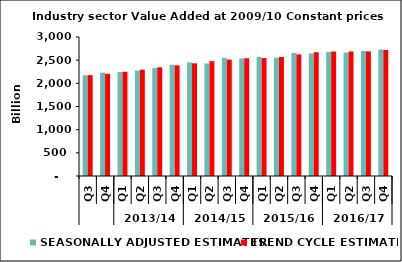
| Category | SEASONALLY ADJUSTED ESTIMATES | TREND CYCLE ESTIMATES |
|---|---|---|
| 0 | 2172.277 | 2176.572 |
| 1 | 2229.677 | 2205.777 |
| 2 | 2242.271 | 2248.863 |
| 3 | 2274.818 | 2294.977 |
| 4 | 2329.412 | 2345.355 |
| 5 | 2401.892 | 2388.535 |
| 6 | 2452.677 | 2432.364 |
| 7 | 2428.52 | 2478.149 |
| 8 | 2548.748 | 2513.195 |
| 9 | 2538.229 | 2540.852 |
| 10 | 2572.239 | 2545.135 |
| 11 | 2552.452 | 2567.774 |
| 12 | 2653.163 | 2624.783 |
| 13 | 2644.685 | 2671.883 |
| 14 | 2680.636 | 2686.366 |
| 15 | 2664.487 | 2688.186 |
| 16 | 2697.725 | 2689.387 |
| 17 | 2732.513 | 2720.011 |